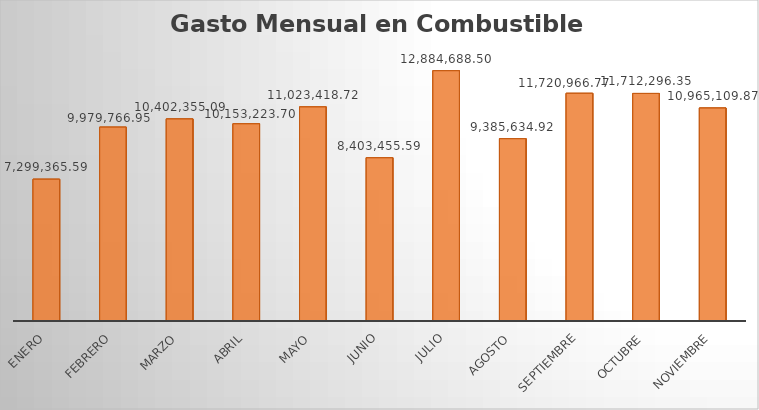
| Category | Monto |
|---|---|
| Enero | 7299365.59 |
| Febrero | 9979766.95 |
| Marzo | 10402355.09 |
| ABRIL | 10153223.7 |
| MAYO | 11023418.72 |
| JUNIO | 8403455.59 |
| JULIO | 12884688.5 |
| AGOSTO | 9385634.92 |
| SEPTIEMBRE | 11720966.77 |
| OCTUBRE | 11712296.35 |
| NOVIEMBRE | 10965109.87 |